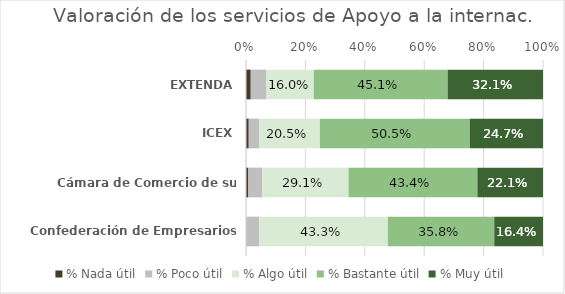
| Category | % Nada útil | % Poco útil | % Algo útil | % Bastante útil | % Muy útil |
|---|---|---|---|---|---|
| EXTENDA | 0.016 | 0.053 | 0.16 | 0.451 | 0.321 |
| ICEX | 0.009 | 0.035 | 0.205 | 0.505 | 0.247 |
| Cámara de Comercio de su provincia | 0.008 | 0.047 | 0.291 | 0.434 | 0.221 |
| Confederación de Empresarios (CEA) | 0 | 0.045 | 0.433 | 0.358 | 0.164 |